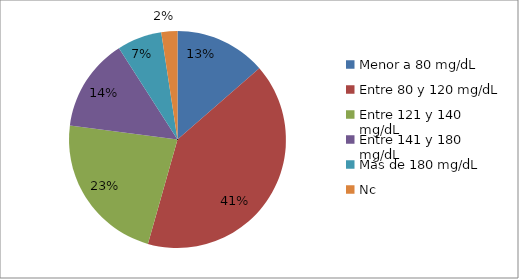
| Category | Series 0 | Series 1 | Series 2 |
|---|---|---|---|
| Menor a 80 mg/dL |  |  | 51 |
| Entre 80 y 120 mg/dL |  |  | 153 |
| Entre 121 y 140 mg/dL |  |  | 85 |
| Entre 141 y 180 mg/dL |  |  | 52 |
| Más de 180 mg/dL |  |  | 25 |
| Nc |  |  | 9 |